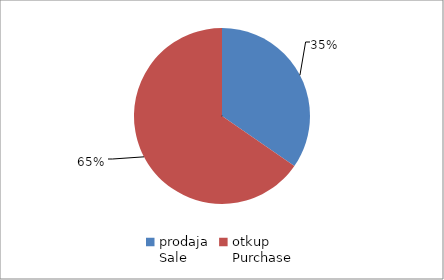
| Category | Series 0 |
|---|---|
| prodaja
Sale | 14423212.1 |
| otkup
Purchase | 27217683.67 |